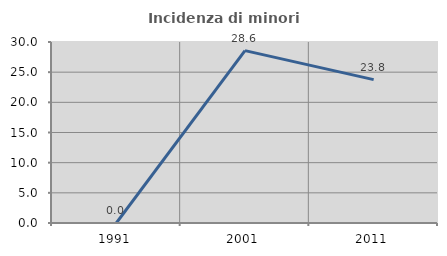
| Category | Incidenza di minori stranieri |
|---|---|
| 1991.0 | 0 |
| 2001.0 | 28.571 |
| 2011.0 | 23.762 |